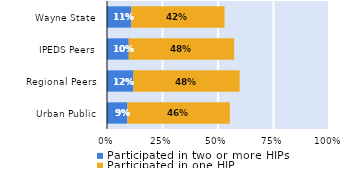
| Category | Participated in two or more HIPs | Participated in one HIP |
|---|---|---|
| Urban Public | 0.092 | 0.461 |
| Regional Peers | 0.119 | 0.478 |
| IPEDS Peers | 0.098 | 0.475 |
| Wayne State | 0.109 | 0.42 |